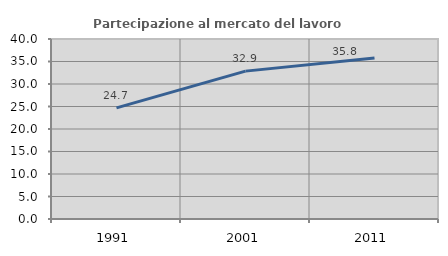
| Category | Partecipazione al mercato del lavoro  femminile |
|---|---|
| 1991.0 | 24.693 |
| 2001.0 | 32.861 |
| 2011.0 | 35.768 |